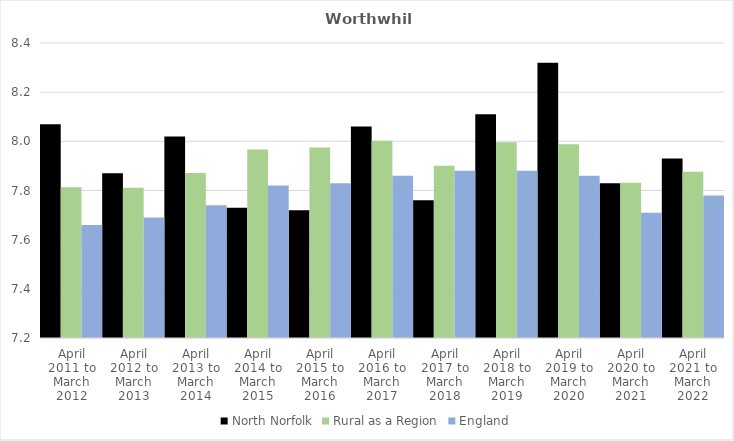
| Category | North Norfolk | Rural as a Region | England |
|---|---|---|---|
| April 2011 to March 2012 | 8.07 | 7.813 | 7.66 |
| April 2012 to March 2013 | 7.87 | 7.811 | 7.69 |
| April 2013 to March 2014 | 8.02 | 7.871 | 7.74 |
| April 2014 to March 2015 | 7.73 | 7.967 | 7.82 |
| April 2015 to March 2016 | 7.72 | 7.975 | 7.83 |
| April 2016 to March 2017 | 8.06 | 8.002 | 7.86 |
| April 2017 to March 2018 | 7.76 | 7.9 | 7.88 |
| April 2018 to March 2019 | 8.11 | 7.996 | 7.88 |
| April 2019 to March 2020 | 8.32 | 7.988 | 7.86 |
| April 2020 to March 2021 | 7.83 | 7.831 | 7.71 |
| April 2021 to March 2022 | 7.93 | 7.877 | 7.78 |